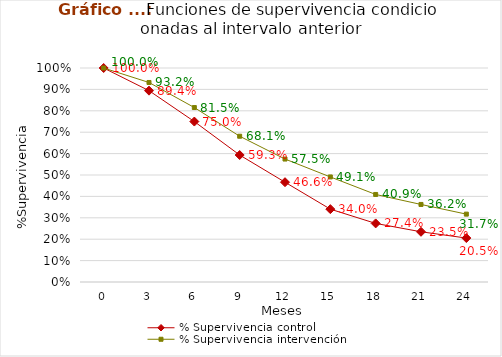
| Category | % Supervivencia control | % Supervivencia intervención |
|---|---|---|
| 0.0 | 1 | 1 |
| 3.0 | 0.894 | 0.932 |
| 6.0 | 0.75 | 0.815 |
| 9.0 | 0.593 | 0.681 |
| 12.0 | 0.466 | 0.575 |
| 15.0 | 0.34 | 0.491 |
| 18.0 | 0.274 | 0.409 |
| 21.0 | 0.235 | 0.362 |
| 24.0 | 0.205 | 0.317 |